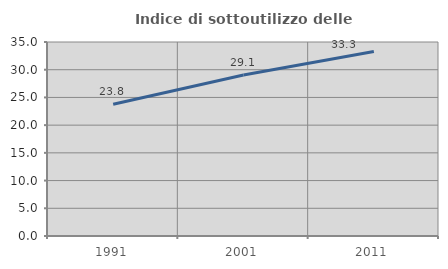
| Category | Indice di sottoutilizzo delle abitazioni  |
|---|---|
| 1991.0 | 23.779 |
| 2001.0 | 29.054 |
| 2011.0 | 33.301 |